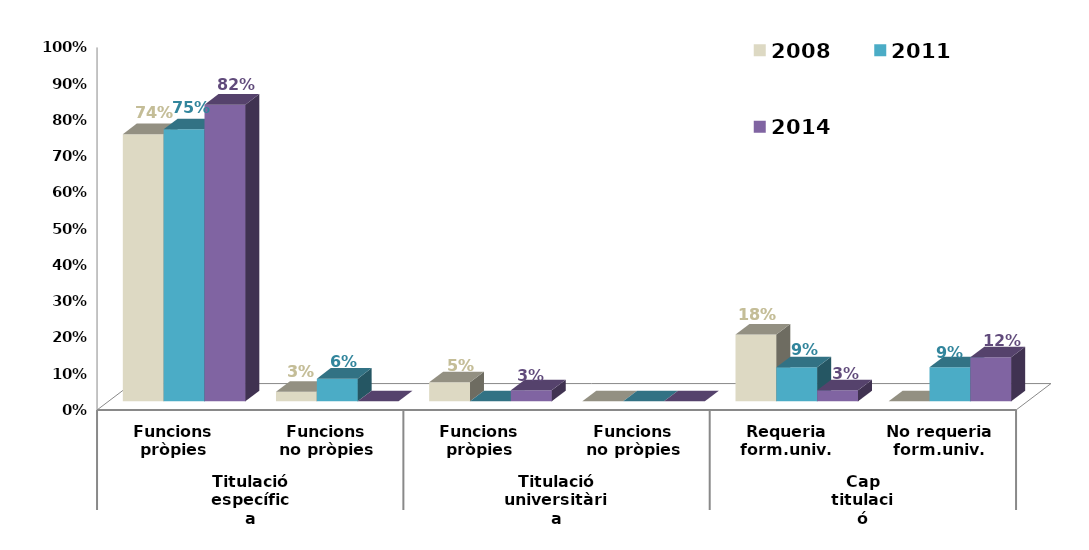
| Category | 2008 | 2011 | 2014 |
|---|---|---|---|
| 0 | 0.737 | 0.75 | 0.818 |
| 1 | 0.026 | 0.062 | 0 |
| 2 | 0.053 | 0 | 0.03 |
| 3 | 0 | 0 | 0 |
| 4 | 0.184 | 0.094 | 0.03 |
| 5 | 0 | 0.094 | 0.121 |